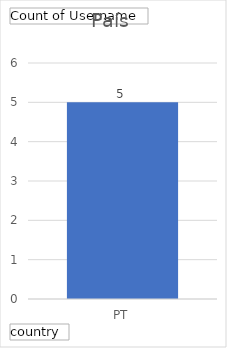
| Category | Total |
|---|---|
| PT | 5 |